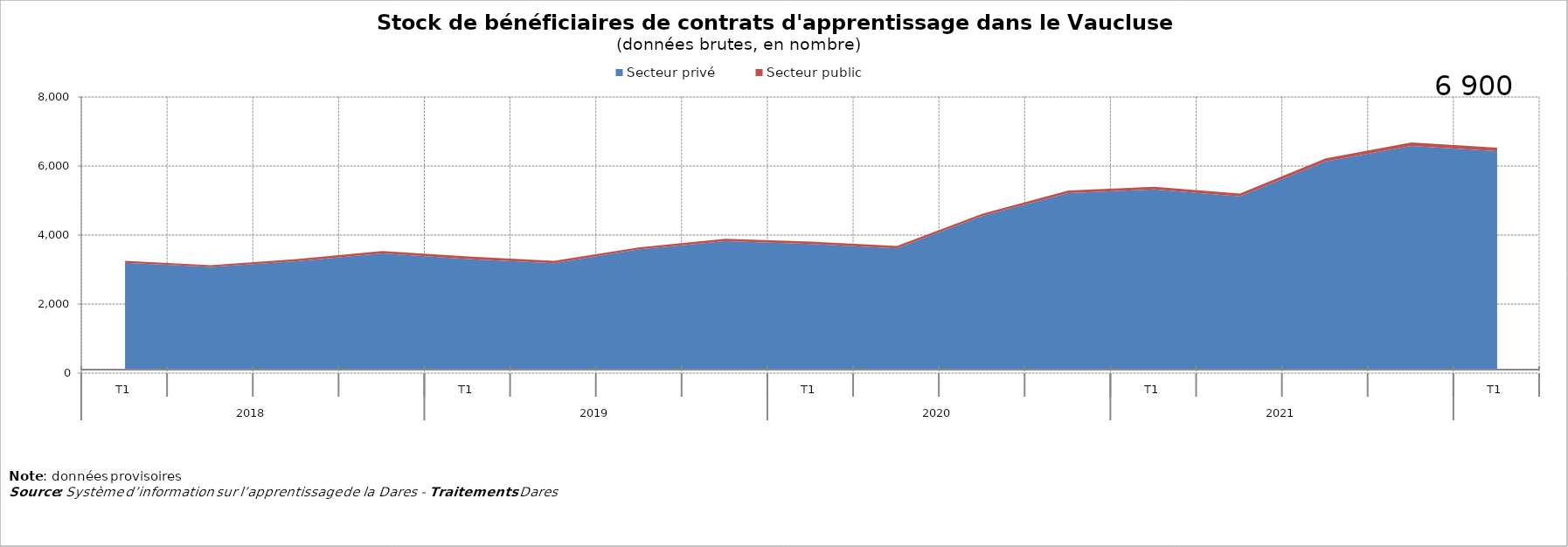
| Category | Secteur privé | Secteur public |
|---|---|---|
| 0 | 3199 | 52 |
| 1 | 3076 | 51 |
| 2 | 3241 | 60 |
| 3 | 3469 | 72 |
| 4 | 3306 | 72 |
| 5 | 3182 | 70 |
| 6 | 3587 | 58 |
| 7 | 3824 | 67 |
| 8 | 3738 | 69 |
| 9 | 3612 | 69 |
| 10 | 4556 | 65 |
| 11 | 5214 | 79 |
| 12 | 5320 | 81 |
| 13 | 5122 | 79 |
| 14 | 6135 | 88 |
| 15 | 6583 | 100 |
| 16 | 6433 | 100 |